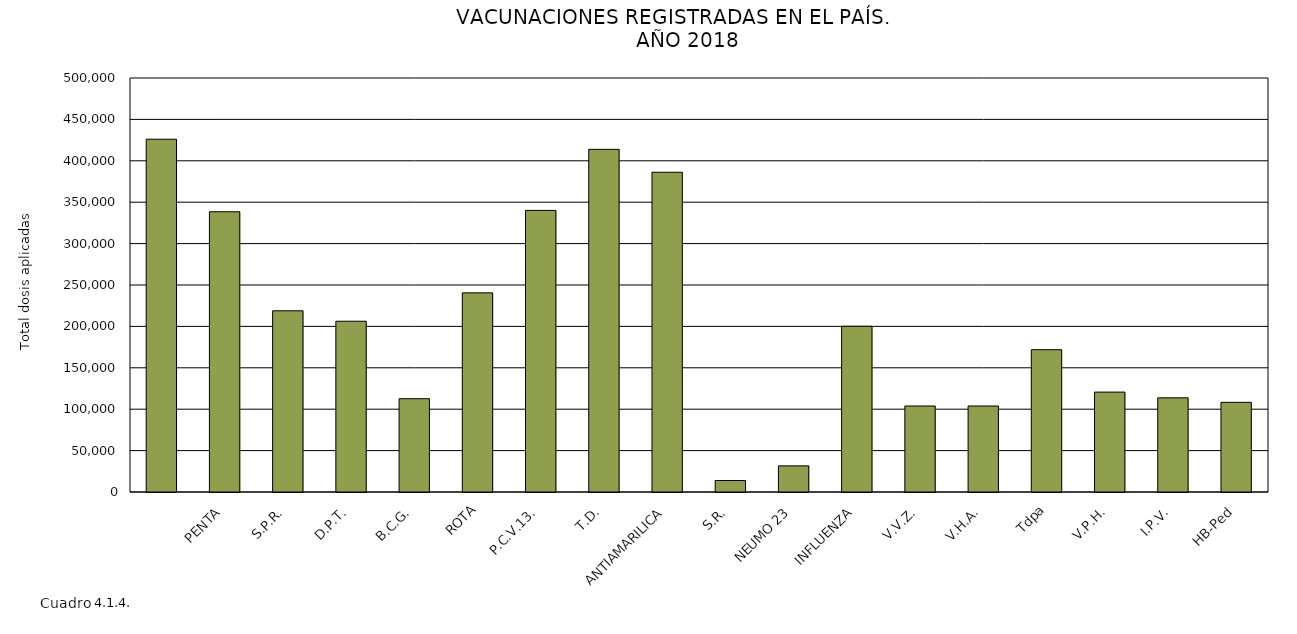
| Category | 2018 |
|---|---|
|  | 426080 |
| PENTA | 338450 |
| S.P.R. | 218832 |
| D.P.T. | 206222 |
| B.C.G. | 112660 |
| ROTA | 240497 |
| P.C.V.13. | 340091 |
| T.D. | 413854 |
| ANTIAMARILICA | 386163 |
| S.R. | 13902 |
| NEUMO 23 | 31562 |
| INFLUENZA | 200184 |
| V.V.Z. | 103851 |
| V.H.A. | 103846 |
| Tdpa | 171873 |
| V.P.H. | 120667 |
| I.P.V. | 113741 |
| HB-Ped | 108317 |